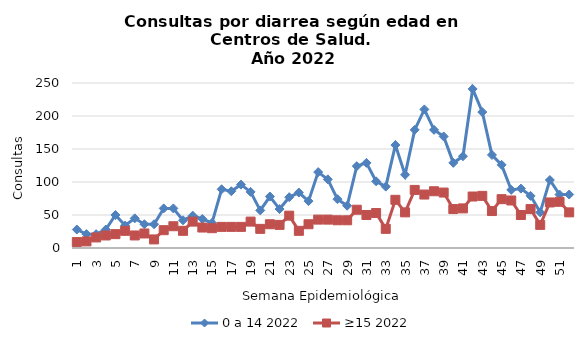
| Category | 0 a 14 2022 | ≥15 2022 |
|---|---|---|
| 1.0 | 28 | 9 |
| 2.0 | 21 | 10 |
| 3.0 | 21 | 16 |
| 4.0 | 28 | 19 |
| 5.0 | 50 | 21 |
| 6.0 | 34 | 26 |
| 7.0 | 45 | 19 |
| 8.0 | 36 | 22 |
| 9.0 | 36 | 13 |
| 10.0 | 60 | 27 |
| 11.0 | 60 | 33 |
| 12.0 | 42 | 26 |
| 13.0 | 49 | 40 |
| 14.0 | 44 | 31 |
| 15.0 | 38 | 30 |
| 16.0 | 89 | 32 |
| 17.0 | 86 | 32 |
| 18.0 | 96 | 32 |
| 19.0 | 85 | 40 |
| 20.0 | 57 | 29 |
| 21.0 | 78 | 36 |
| 22.0 | 59 | 35 |
| 23.0 | 77 | 49 |
| 24.0 | 84 | 26 |
| 25.0 | 71 | 36 |
| 26.0 | 115 | 43 |
| 27.0 | 104 | 43 |
| 28.0 | 74 | 42 |
| 29.0 | 64 | 42 |
| 30.0 | 124 | 58 |
| 31.0 | 129 | 50 |
| 32.0 | 101 | 53 |
| 33.0 | 93 | 29 |
| 34.0 | 156 | 73 |
| 35.0 | 111 | 54 |
| 36.0 | 179 | 88 |
| 37.0 | 210 | 81 |
| 38.0 | 179 | 86 |
| 39.0 | 169 | 84 |
| 40.0 | 129 | 59 |
| 41.0 | 139 | 60 |
| 42.0 | 241 | 78 |
| 43.0 | 206 | 79 |
| 44.0 | 141 | 56 |
| 45.0 | 126 | 74 |
| 46.0 | 88 | 72 |
| 47.0 | 90 | 50 |
| 48.0 | 79 | 59 |
| 49.0 | 54 | 35 |
| 50.0 | 103 | 69 |
| 51.0 | 81 | 70 |
| 52.0 | 81 | 54 |